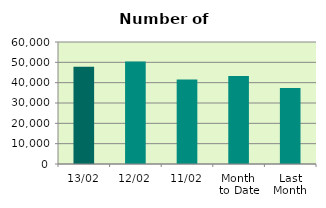
| Category | Series 0 |
|---|---|
| 13/02 | 47788 |
| 12/02 | 50464 |
| 11/02 | 41580 |
| Month 
to Date | 43239.556 |
| Last
Month | 37374.818 |